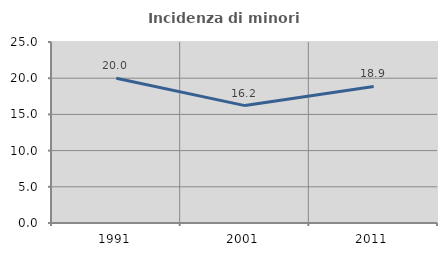
| Category | Incidenza di minori stranieri |
|---|---|
| 1991.0 | 20 |
| 2001.0 | 16.216 |
| 2011.0 | 18.868 |